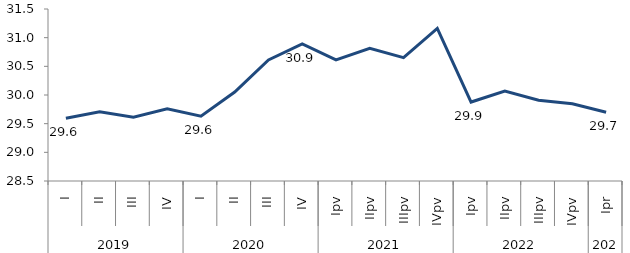
| Category | Series 0 |
|---|---|
| 0 | 29.595 |
| 1 | 29.707 |
| 2 | 29.612 |
| 3 | 29.758 |
| 4 | 29.631 |
| 5 | 30.051 |
| 6 | 30.612 |
| 7 | 30.89 |
| 8 | 30.612 |
| 9 | 30.813 |
| 10 | 30.651 |
| 11 | 31.16 |
| 12 | 29.877 |
| 13 | 30.067 |
| 14 | 29.908 |
| 15 | 29.848 |
| 16 | 29.7 |